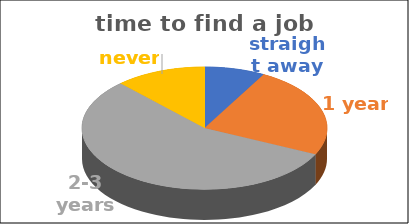
| Category | time to find a job | Series 1 | Series 2 | Series 3 | Series 4 |
|---|---|---|---|---|---|
| straight away | 0.08 |  |  |  |  |
| 1 year | 0.24 |  |  |  |  |
| 2-3 years | 0.56 |  |  |  |  |
| never | 0.12 |  |  |  |  |